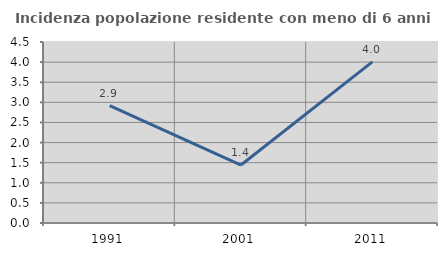
| Category | Incidenza popolazione residente con meno di 6 anni |
|---|---|
| 1991.0 | 2.921 |
| 2001.0 | 1.441 |
| 2011.0 | 4.007 |